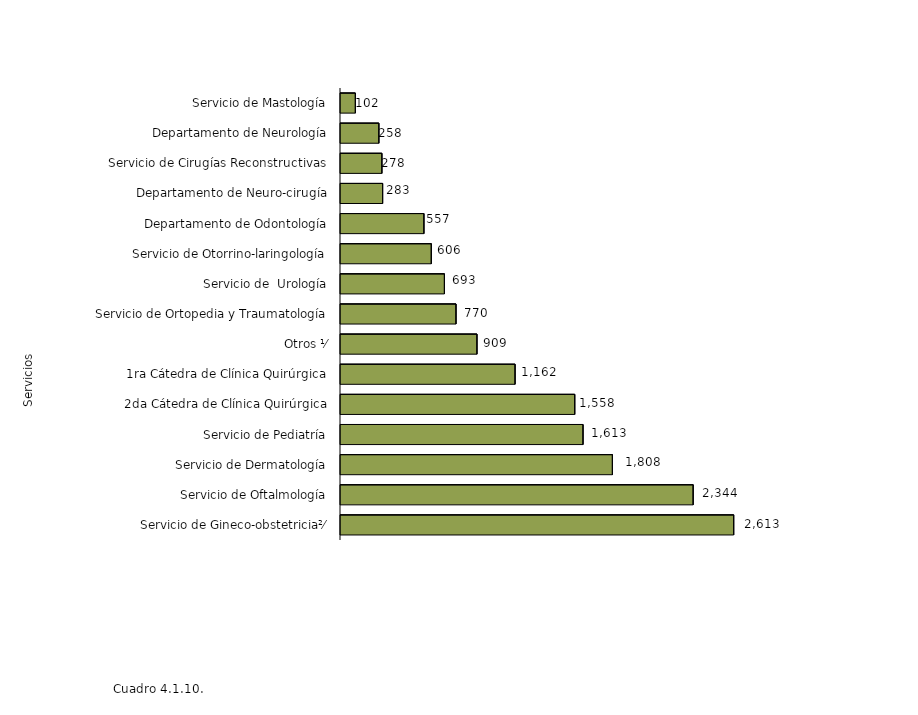
| Category | Series 0 |
|---|---|
| Servicio de Gineco-obstetricia²⁄ | 2613 |
| Servicio de Oftalmología | 2344 |
| Servicio de Dermatología | 1808 |
| Servicio de Pediatría | 1613 |
| 2da Cátedra de Clínica Quirúrgica | 1558 |
| 1ra Cátedra de Clínica Quirúrgica | 1162 |
| Otros ⅟ | 909 |
| Servicio de Ortopedia y Traumatología | 770 |
| Servicio de  Urología | 693 |
| Servicio de Otorrino-laringología | 606 |
| Departamento de Odontología | 557 |
| Departamento de Neuro-cirugía | 283 |
| Servicio de Cirugías Reconstructivas | 278 |
| Departamento de Neurología | 258 |
| Servicio de Mastología | 102 |